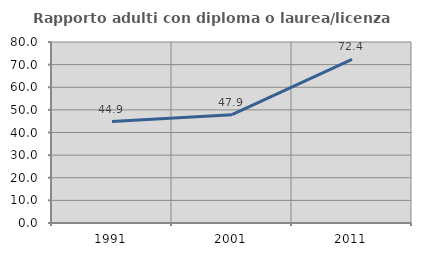
| Category | Rapporto adulti con diploma o laurea/licenza media  |
|---|---|
| 1991.0 | 44.86 |
| 2001.0 | 47.853 |
| 2011.0 | 72.362 |